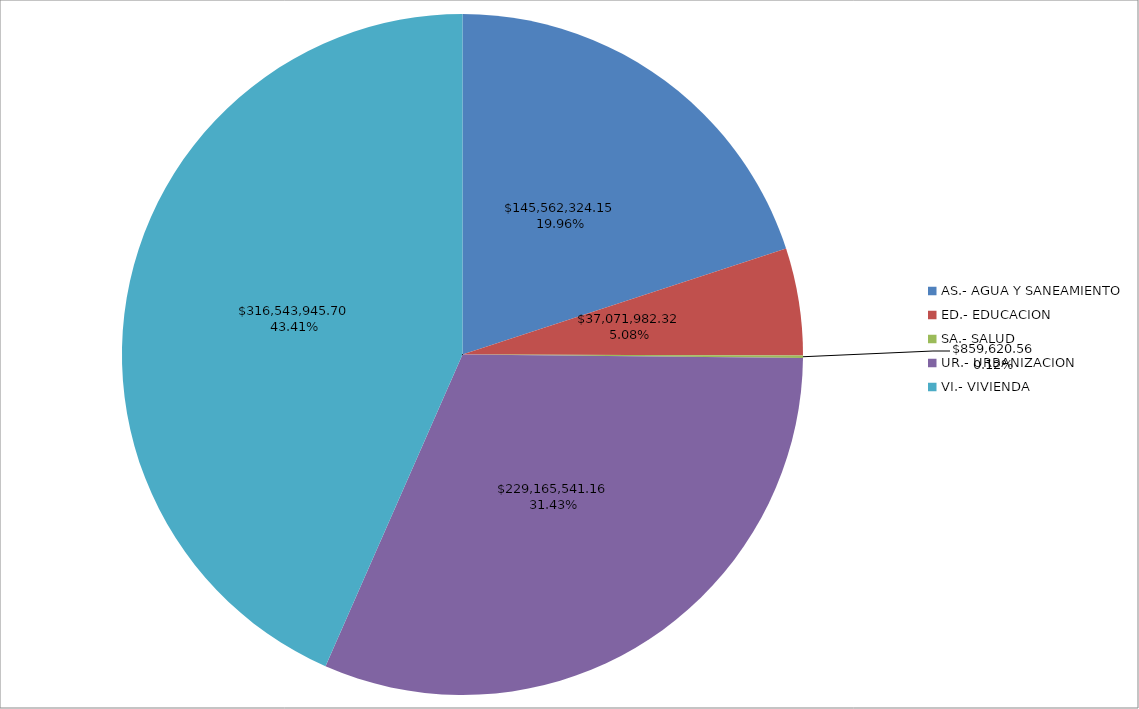
| Category | Serie 1 | Serie 2 |
|---|---|---|
| AS.- AGUA Y SANEAMIENTO | 145562324.15 | 0.2 |
| ED.- EDUCACION | 37071982.32 | 0.051 |
| SA.- SALUD | 859620.56 | 0.001 |
| UR.- URBANIZACION | 229165541.16 | 0.314 |
| VI.- VIVIENDA | 316543945.7 | 0.434 |